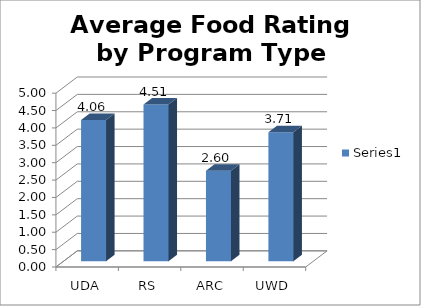
| Category | Series 0 |
|---|---|
| UDA | 4.061 |
| RS | 4.506 |
| ARC | 2.6 |
| UWD | 3.709 |